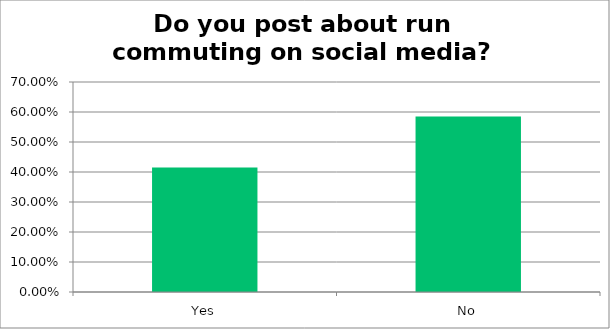
| Category | Responses |
|---|---|
| Yes | 0.415 |
| No | 0.585 |